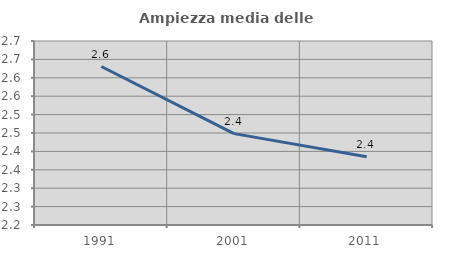
| Category | Ampiezza media delle famiglie |
|---|---|
| 1991.0 | 2.631 |
| 2001.0 | 2.448 |
| 2011.0 | 2.385 |